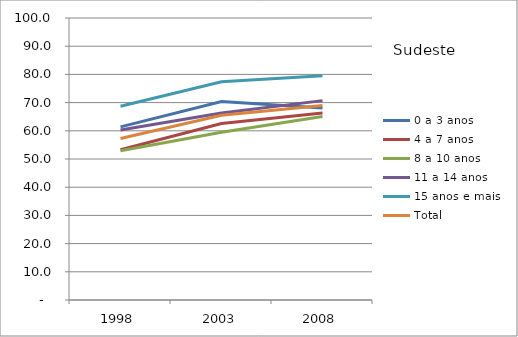
| Category | 0 a 3 anos | 4 a 7 anos | 8 a 10 anos | 11 a 14 anos | 15 anos e mais | Total |
|---|---|---|---|---|---|---|
| 1998.0 | 61.4 | 53.3 | 52.9 | 60.3 | 68.7 | 57.3 |
| 2003.0 | 70.4 | 62.6 | 59.5 | 66.3 | 77.4 | 65.5 |
| 2008.0 | 68.1 | 66.3 | 65.1 | 70.7 | 79.5 | 69 |